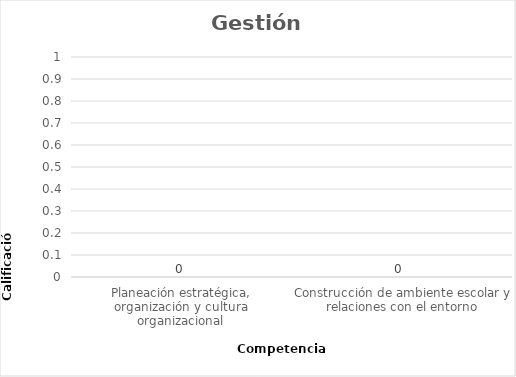
| Category | Series 0 |
|---|---|
| Planeación estratégica, organización y cultura organizacional | 0 |
| Construcción de ambiente escolar y relaciones con el entorno | 0 |